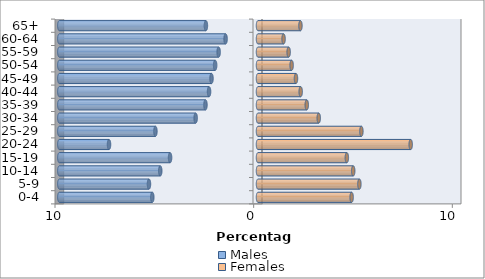
| Category | Males | Females |
|---|---|---|
| 0-4 | -5.32 | 4.713 |
| 5-9 | -5.489 | 5.103 |
| 10-14 | -4.92 | 4.792 |
| 15-19 | -4.426 | 4.472 |
| 20-24 | -7.5 | 7.685 |
| 25-29 | -5.164 | 5.205 |
| 30-34 | -3.139 | 3.057 |
| 35-39 | -2.645 | 2.454 |
| 40-44 | -2.464 | 2.148 |
| 45-49 | -2.341 | 1.912 |
| 50-54 | -2.158 | 1.692 |
| 55-59 | -1.982 | 1.543 |
| 60-64 | -1.632 | 1.287 |
| 65+ | -2.623 | 2.136 |